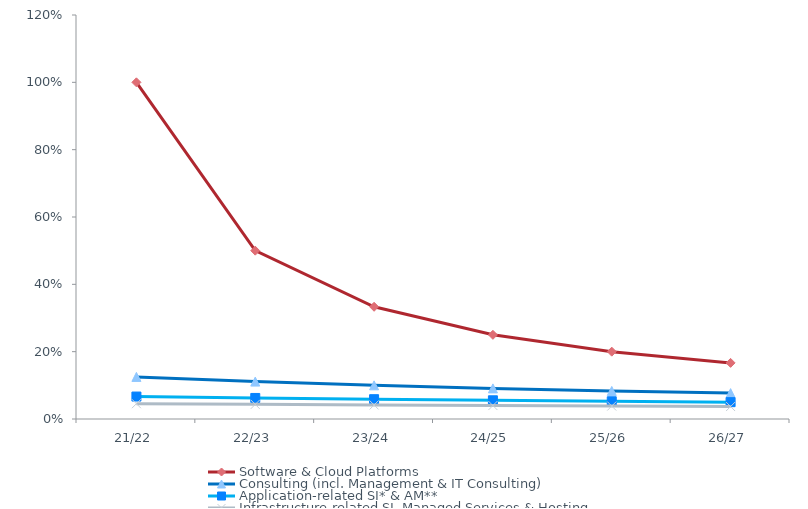
| Category | Software & Cloud Platforms | Consulting (incl. Management & IT Consulting) | Application-related SI* & AM** | Infrastructure-related SI, Managed Services & Hosting |
|---|---|---|---|---|
| 21/22 | 1 | 0.125 | 0.067 | 0.045 |
| 22/23 | 0.5 | 0.111 | 0.062 | 0.043 |
| 23/24 | 0.333 | 0.1 | 0.059 | 0.042 |
| 24/25 | 0.25 | 0.091 | 0.056 | 0.04 |
| 25/26 | 0.2 | 0.083 | 0.053 | 0.038 |
| 26/27 | 0.167 | 0.077 | 0.05 | 0.037 |